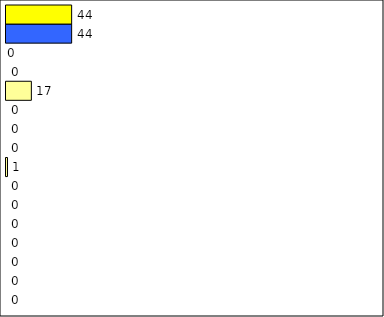
| Category | -2 | -1 | 0 | 1 | 2 | 3 | 4 | 5 | 6 | 7 | 8 | 9 | 10 | 11 | 12 | Perfect Round |
|---|---|---|---|---|---|---|---|---|---|---|---|---|---|---|---|---|
| 0 | 0 | 0 | 0 | 0 | 0 | 0 | 0 | 1 | 0 | 0 | 0 | 17 | 0 | 0 | 44 | 44 |